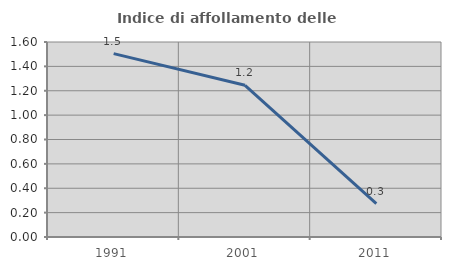
| Category | Indice di affollamento delle abitazioni  |
|---|---|
| 1991.0 | 1.505 |
| 2001.0 | 1.245 |
| 2011.0 | 0.274 |